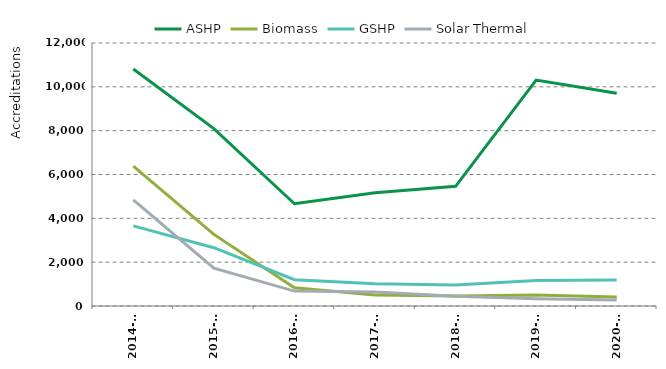
| Category | ASHP | Biomass | GSHP | Solar Thermal |
|---|---|---|---|---|
| 2014-15 | 10811 | 6380 | 3655 | 4844 |
| 2015-16 | 8094 | 3266 | 2659 | 1722 |
| 2016-17 | 4664 | 829 | 1198 | 679 |
| 2017-18 | 5168 | 505 | 1019 | 643 |
| 2018-19 | 5462 | 451 | 955 | 448 |
| 2019-20 | 10308 | 497 | 1160 | 334 |
| 2020-21 | 9710 | 411 | 1191 | 274 |